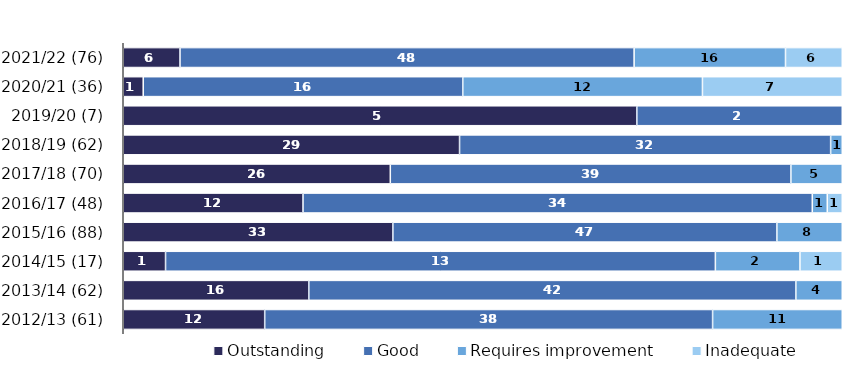
| Category | Outstanding | Good | Requires improvement | Inadequate |
|---|---|---|---|---|
| 2021/22 (76) | 6 | 48 | 16 | 6 |
| 2020/21 (36) | 1 | 16 | 12 | 7 |
| 2019/20 (7) | 5 | 2 | 0 | 0 |
| 2018/19 (62) | 29 | 32 | 1 | 0 |
| 2017/18 (70) | 26 | 39 | 5 | 0 |
| 2016/17 (48) | 12 | 34 | 1 | 1 |
| 2015/16 (88) | 33 | 47 | 8 | 0 |
| 2014/15 (17) | 1 | 13 | 2 | 1 |
| 2013/14 (62) | 16 | 42 | 4 | 0 |
| 2012/13 (61) | 12 | 38 | 11 | 0 |